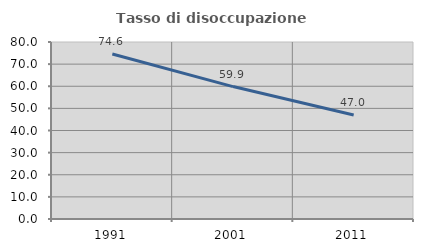
| Category | Tasso di disoccupazione giovanile  |
|---|---|
| 1991.0 | 74.564 |
| 2001.0 | 59.852 |
| 2011.0 | 46.971 |